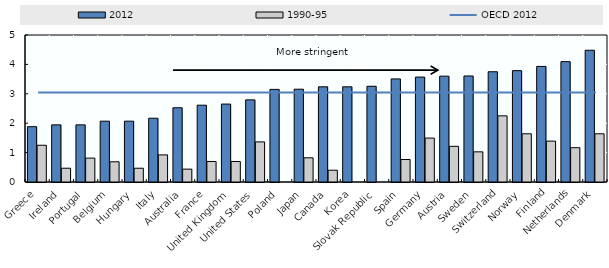
| Category | 2012 | 1990-95 |
|---|---|---|
| Greece | 1.881 | 1.25 |
| Ireland | 1.944 | 0.469 |
| Portugal | 1.944 | 0.812 |
| Belgium | 2.069 | 0.688 |
| Hungary | 2.069 | 0.469 |
| Italy | 2.169 | 0.922 |
| Australia | 2.525 | 0.438 |
| France | 2.612 | 0.698 |
| United Kingdom | 2.65 | 0.698 |
| United States | 2.794 | 1.365 |
| Poland | 3.15 | 0 |
| Japan | 3.156 | 0.823 |
| Canada | 3.238 | 0.401 |
| Korea | 3.238 | 0 |
| Slovak Republic | 3.256 | 0 |
| Spain | 3.506 | 0.766 |
| Germany | 3.569 | 1.494 |
| Austria | 3.6 | 1.214 |
| Sweden | 3.606 | 1.026 |
| Switzerland | 3.75 | 2.25 |
| Norway | 3.788 | 1.641 |
| Finland | 3.931 | 1.391 |
| Netherlands | 4.094 | 1.167 |
| Denmark | 4.481 | 1.641 |